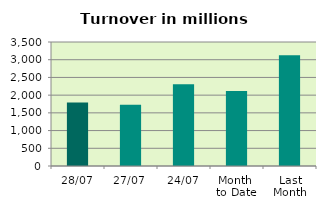
| Category | Series 0 |
|---|---|
| 28/07 | 1794.79 |
| 27/07 | 1731.421 |
| 24/07 | 2310.867 |
| Month 
to Date | 2118.59 |
| Last
Month | 3125.17 |